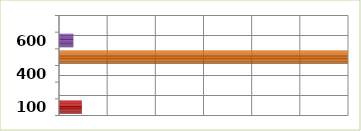
| Category | Series 0 |
|---|---|
| 100.0 | 4739814 |
| 200.0 | 0 |
| 400.0 | 0 |
| 500.0 | 59947563 |
| 600.0 | 2981326 |
| 700.0 | 0 |